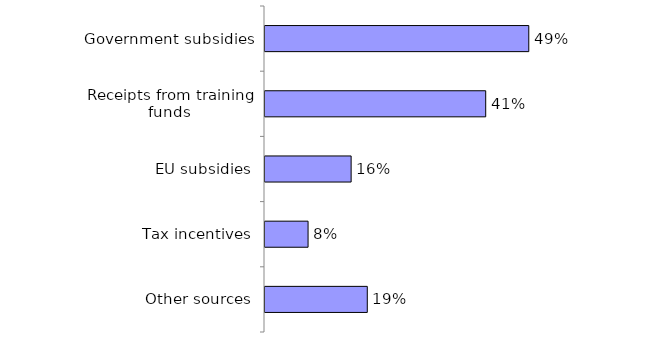
| Category | Series 0 |
|---|---|
| Government subsidies | 0.49 |
| Receipts from training funds | 0.41 |
| EU subsidies | 0.16 |
| Tax incentives | 0.08 |
| Other sources | 0.19 |